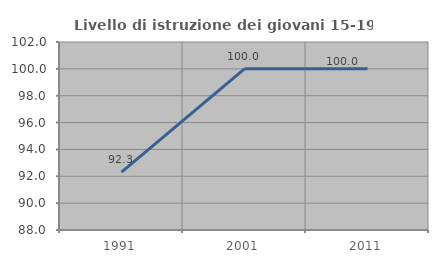
| Category | Livello di istruzione dei giovani 15-19 anni |
|---|---|
| 1991.0 | 92.308 |
| 2001.0 | 100 |
| 2011.0 | 100 |